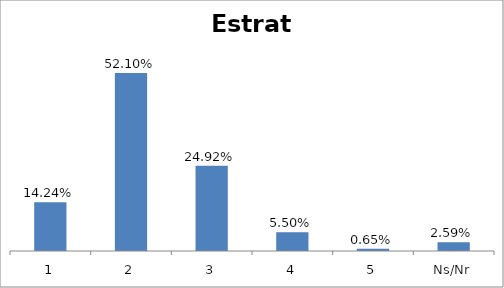
| Category | Total |
|---|---|
| 1 | 0.142 |
| 2 | 0.521 |
| 3 | 0.249 |
| 4 | 0.055 |
| 5 | 0.006 |
| Ns/Nr | 0.026 |